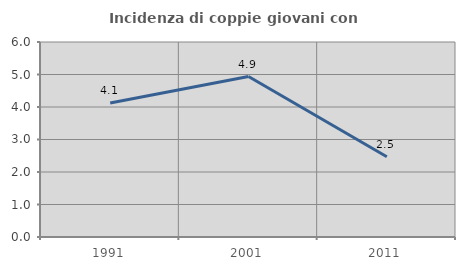
| Category | Incidenza di coppie giovani con figli |
|---|---|
| 1991.0 | 4.124 |
| 2001.0 | 4.938 |
| 2011.0 | 2.469 |